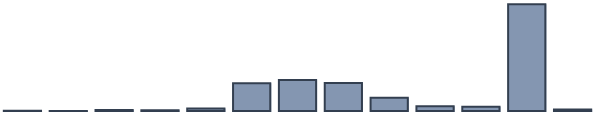
| Category | Series 0 |
|---|---|
| 0 | 0.064 |
| 1 | 0.056 |
| 2 | 0.424 |
| 3 | 0.345 |
| 4 | 1.145 |
| 5 | 12.525 |
| 6 | 13.998 |
| 7 | 12.636 |
| 8 | 5.973 |
| 9 | 2.102 |
| 10 | 1.969 |
| 11 | 48.134 |
| 12 | 0.629 |